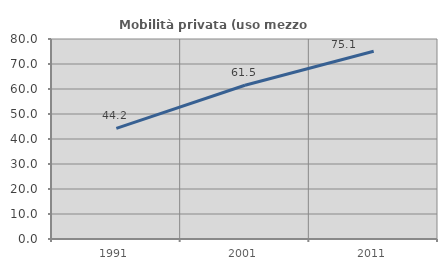
| Category | Mobilità privata (uso mezzo privato) |
|---|---|
| 1991.0 | 44.24 |
| 2001.0 | 61.511 |
| 2011.0 | 75.085 |